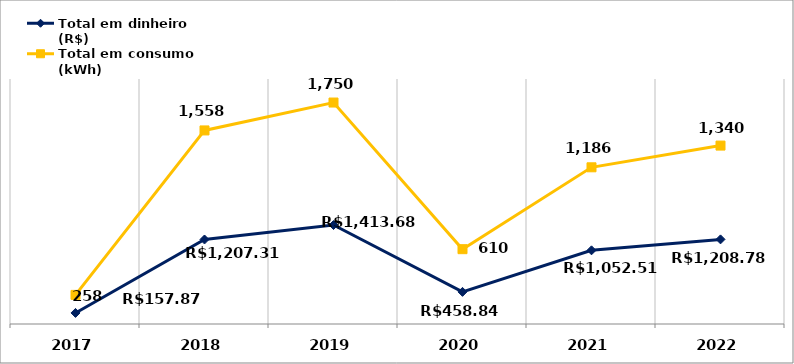
| Category | Total em dinheiro (R$) | Total em consumo (kWh) |
|---|---|---|
| 2017.0 | 157.87 | 258 |
| 2018.0 | 1207.31 | 1558 |
| 2019.0 | 1413.68 | 1750 |
| 2020.0 | 458.84 | 610 |
| 2021.0 | 1052.51 | 1186 |
| 2022.0 | 1208.78 | 1340 |